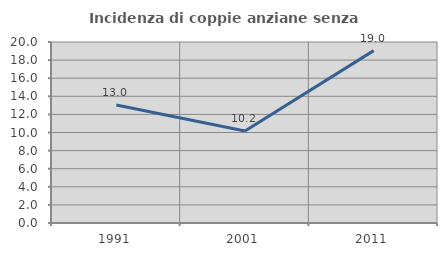
| Category | Incidenza di coppie anziane senza figli  |
|---|---|
| 1991.0 | 13.043 |
| 2001.0 | 10.169 |
| 2011.0 | 19.048 |